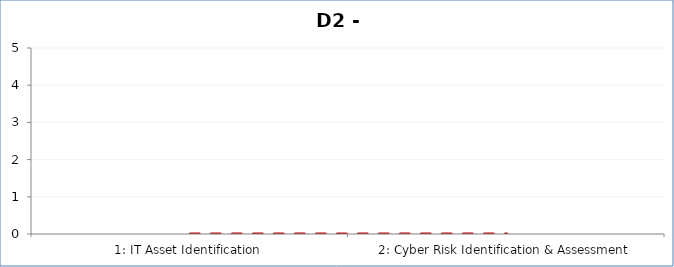
| Category | Assessment Factor Maturity |
|---|---|
| 1: IT Asset Identification | 0 |
| 2: Cyber Risk Identification & Assessment | 0 |